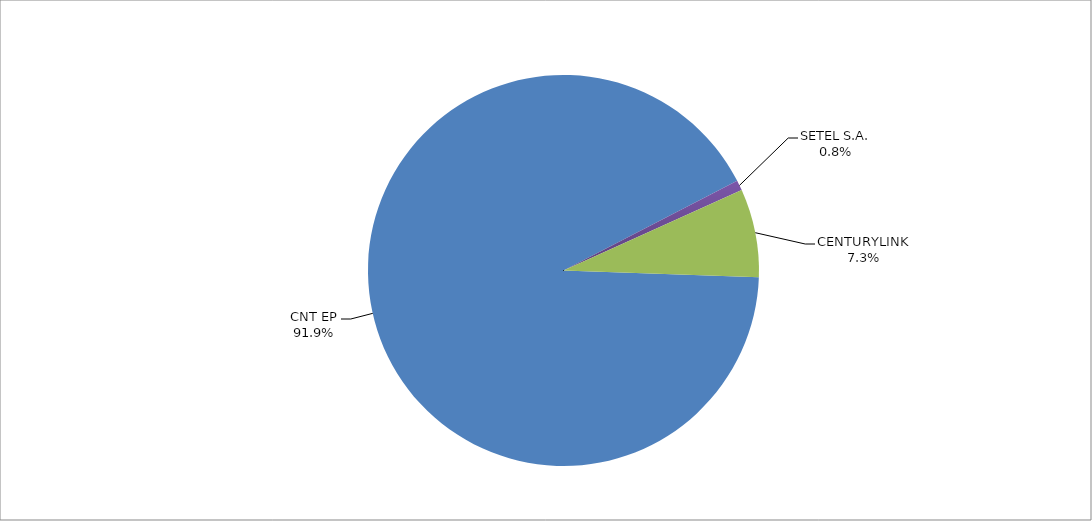
| Category | Series 0 |
|---|---|
| CNT EP | 327 |
| SETEL S.A. | 3 |
| CENTURYLINK | 26 |